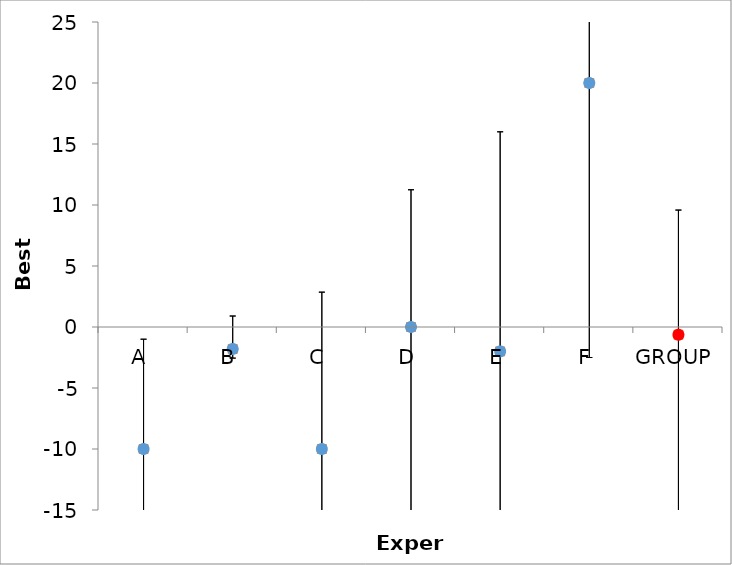
| Category | Series 1 | Series 0 |
|---|---|---|
| A | -10 | -10 |
| B | -1.8 | -1.8 |
| C | -10 | -10 |
| D | 0 | 0 |
| E | -2 | -2 |
| F | 20 | 20 |
| GROUP | -0.633 | -0.633 |